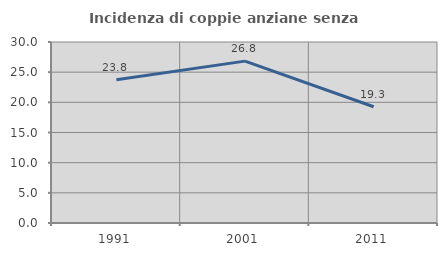
| Category | Incidenza di coppie anziane senza figli  |
|---|---|
| 1991.0 | 23.75 |
| 2001.0 | 26.829 |
| 2011.0 | 19.266 |